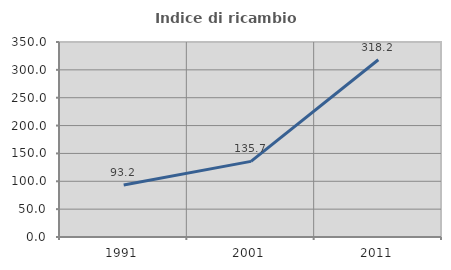
| Category | Indice di ricambio occupazionale  |
|---|---|
| 1991.0 | 93.165 |
| 2001.0 | 135.709 |
| 2011.0 | 318.203 |